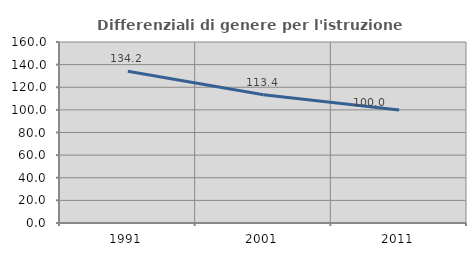
| Category | Differenziali di genere per l'istruzione superiore |
|---|---|
| 1991.0 | 134.192 |
| 2001.0 | 113.419 |
| 2011.0 | 99.955 |